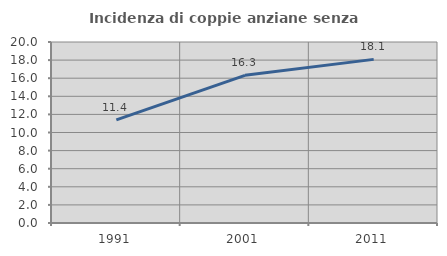
| Category | Incidenza di coppie anziane senza figli  |
|---|---|
| 1991.0 | 11.388 |
| 2001.0 | 16.319 |
| 2011.0 | 18.081 |